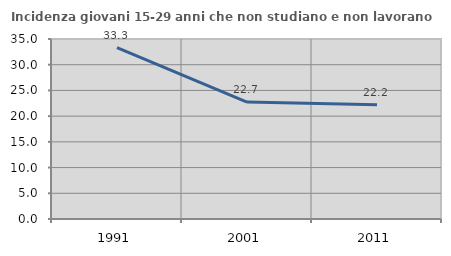
| Category | Incidenza giovani 15-29 anni che non studiano e non lavorano  |
|---|---|
| 1991.0 | 33.333 |
| 2001.0 | 22.727 |
| 2011.0 | 22.222 |